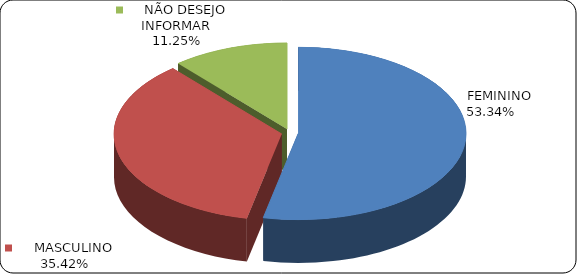
| Category | Series 0 |
|---|---|
|      FEMININO | 0.533 |
|      MASCULINO | 0.354 |
|      NÃO DESEJO INFORMAR | 0.112 |